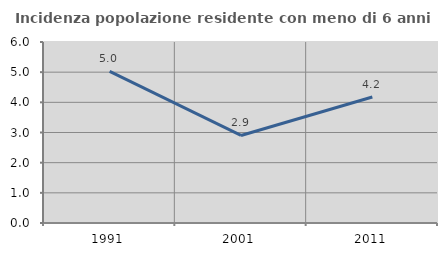
| Category | Incidenza popolazione residente con meno di 6 anni |
|---|---|
| 1991.0 | 5.026 |
| 2001.0 | 2.902 |
| 2011.0 | 4.178 |